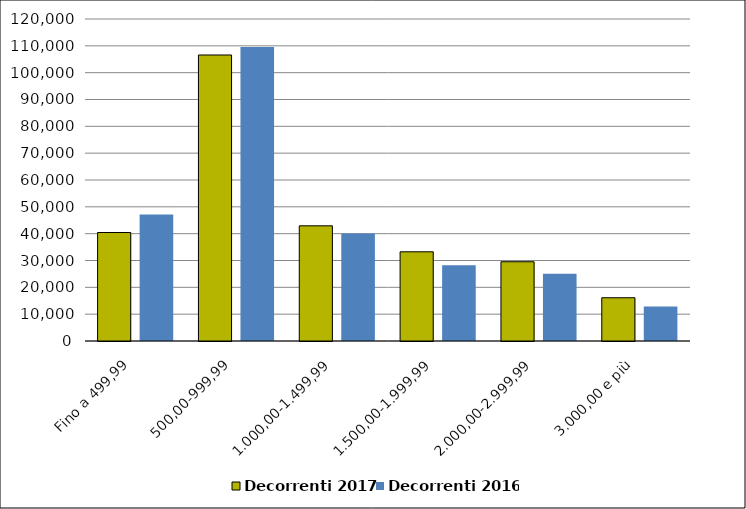
| Category | Decorrenti 2017 | Decorrenti 2016 |
|---|---|---|
| Fino a 499,99 | 40430 | 47169 |
| 500,00-999,99 | 106584 | 109605 |
| 1.000,00-1.499,99 | 42927 | 40102 |
| 1.500,00-1.999,99 | 33242 | 28263 |
| 2.000,00-2.999,99 | 29532 | 25038 |
| 3.000,00 e più | 16120 | 12824 |